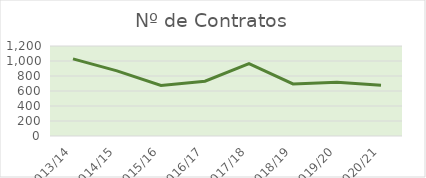
| Category | Contratos |
|---|---|
| 2013/14 | 1028 |
| 2014/15 | 869 |
| 2015/16 | 675 |
| 2016/17 | 730 |
| 2017/18 | 964 |
| 2018/19 | 695 |
| 2019/20 | 716 |
| 2020/21 | 676 |